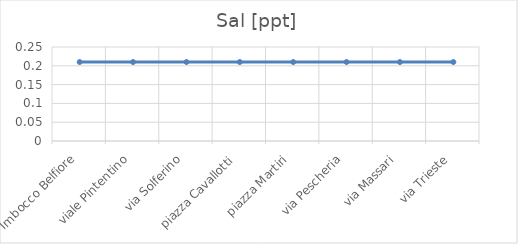
| Category | Sal [ppt] |
|---|---|
| Imbocco Belfiore | 0.21 |
| viale Pintentino | 0.21 |
| via Solferino | 0.21 |
| piazza Cavallotti | 0.21 |
| piazza Martiri | 0.21 |
| via Pescheria | 0.21 |
| via Massari | 0.21 |
| via Trieste | 0.21 |